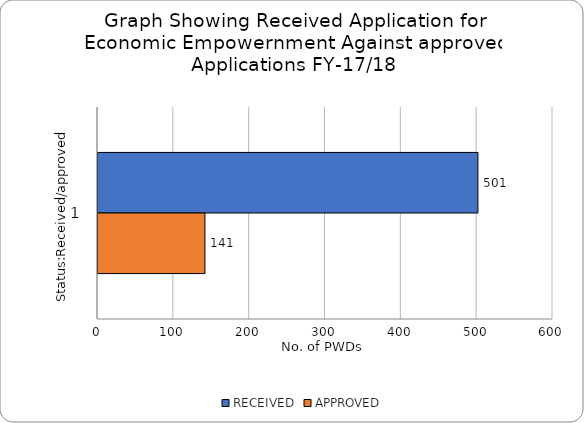
| Category | RECEIVED | APPROVED |
|---|---|---|
| 0 | 501 | 141 |